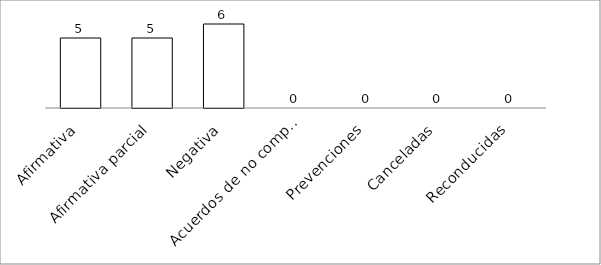
| Category | Series 0 |
|---|---|
| Afirmativa | 5 |
| Afirmativa parcial | 5 |
| Negativa | 6 |
| Acuerdos de no competencia | 0 |
| Prevenciones | 0 |
| Canceladas | 0 |
| Reconducidas | 0 |